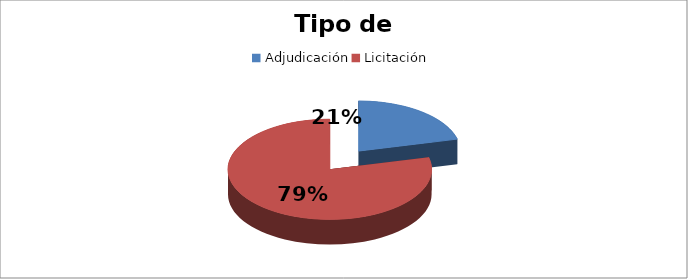
| Category | Suma |
|---|---|
| Adjudicación | 7745764.98 |
| Licitación  | 28878356.64 |